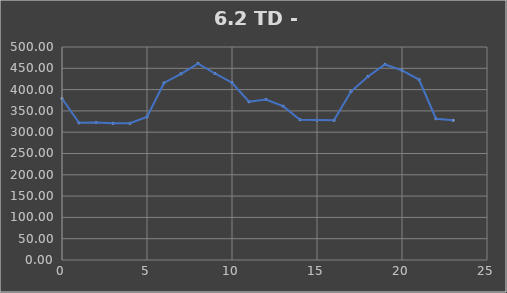
| Category | TOTAL |
|---|---|
| 0.0 | 379.004 |
| 1.0 | 321.934 |
| 2.0 | 322.594 |
| 3.0 | 320.904 |
| 4.0 | 320.904 |
| 5.0 | 336.014 |
| 6.0 | 415.664 |
| 7.0 | 437.064 |
| 8.0 | 461.069 |
| 9.0 | 437.816 |
| 10.0 | 416.166 |
| 11.0 | 371.566 |
| 12.0 | 376.616 |
| 13.0 | 361.136 |
| 14.0 | 329.309 |
| 15.0 | 328.379 |
| 16.0 | 327.979 |
| 17.0 | 395.389 |
| 18.0 | 430.856 |
| 19.0 | 458.966 |
| 20.0 | 445.226 |
| 21.0 | 423.506 |
| 22.0 | 331.629 |
| 23.0 | 327.879 |